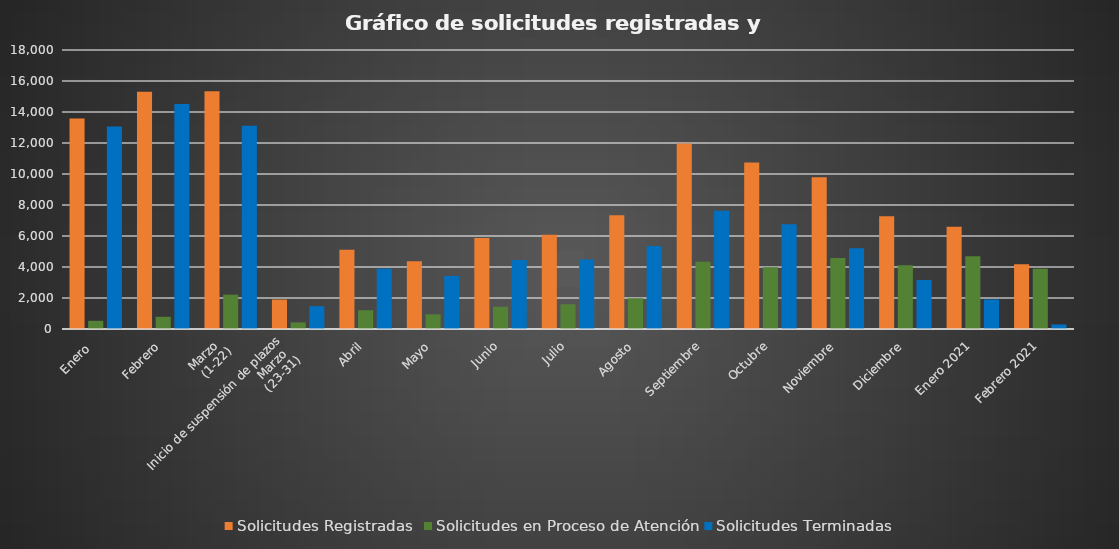
| Category | Solicitudes Registradas  | Solicitudes en Proceso de Atención | Solicitudes Terminadas |
|---|---|---|---|
| Enero  | 13585 | 528 | 13057 |
| Febrero | 15303 | 786 | 14517 |
| Marzo 
(1-22) | 15334 | 2214 | 13120 |
| Inicio de suspensión de plazos
Marzo 
(23-31) | 1899 | 425 | 1474 |
| Abril | 5106 | 1210 | 3896 |
| Mayo | 4371 | 944 | 3427 |
| Junio | 5879 | 1435 | 4444 |
| Julio | 6073 | 1594 | 4479 |
| Agosto | 7337 | 1985 | 5352 |
| Septiembre | 11971 | 4334 | 7637 |
| Octubre | 10744 | 3987 | 6757 |
| Noviembre | 9795 | 4584 | 5211 |
| Diciembre | 7273 | 4112 | 3161 |
| Enero 2021 | 6594 | 4688 | 1906 |
| Febrero 2021 | 4182 | 3891 | 291 |